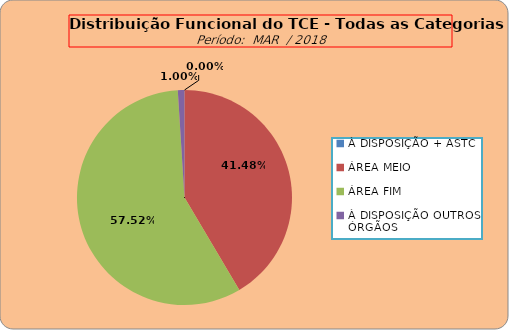
| Category | Series 0 |
|---|---|
| À DISPOSIÇÃO + ASTC | 0 |
| ÁREA MEIO | 207 |
| ÁREA FIM | 287 |
| À DISPOSIÇÃO OUTROS ÓRGÃOS | 5 |